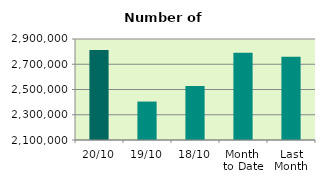
| Category | Series 0 |
|---|---|
| 20/10 | 2813576 |
| 19/10 | 2404488 |
| 18/10 | 2527360 |
| Month 
to Date | 2790734.429 |
| Last
Month | 2759252.364 |